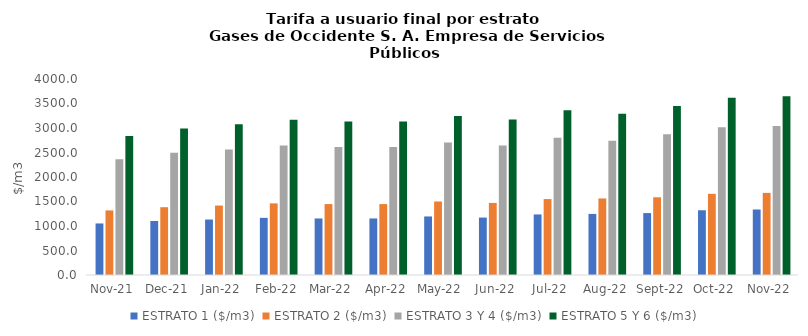
| Category | ESTRATO 1 ($/m3) | ESTRATO 2 ($/m3) | ESTRATO 3 Y 4 ($/m3) | ESTRATO 5 Y 6 ($/m3) |
|---|---|---|---|---|
| 2021-11-01 | 1052.16 | 1317.95 | 2363.8 | 2836.56 |
| 2021-12-01 | 1102.54 | 1383.53 | 2493.54 | 2992.248 |
| 2022-01-01 | 1131.88 | 1417.68 | 2562.7 | 3075.24 |
| 2022-02-01 | 1166.05 | 1461.82 | 2641.32 | 3169.584 |
| 2022-03-01 | 1153.77 | 1447.9 | 2611.29 | 3133.548 |
| 2022-04-01 | 1154.04 | 1447.35 | 2611.79 | 3134.148 |
| 2022-05-01 | 1194.97 | 1500.23 | 2702.77 | 3243.324 |
| 2022-06-01 | 1172.05 | 1470.65 | 2645.4 | 3174.48 |
| 2022-07-01 | 1236.22 | 1549.57 | 2802.9 | 3363.48 |
| 2022-08-01 | 1246.24 | 1562.12 | 2740.82 | 3288.984 |
| 2022-09-01 | 1263.63 | 1585.89 | 2872.55 | 3447.06 |
| 2022-10-01 | 1321.29 | 1657.05 | 3013.74 | 3616.488 |
| 2022-11-01 | 1337.14 | 1675.76 | 3041.35 | 3649.62 |